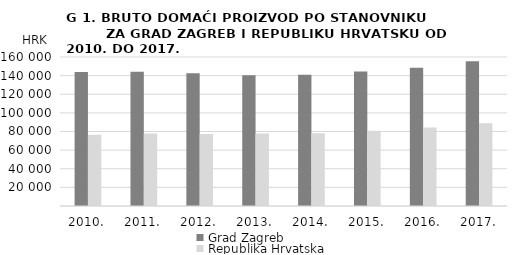
| Category | Grad Zagreb | Republika Hrvatska |
|---|---|---|
| 2010. | 143825.42 | 76536 |
| 2011. | 144287.653 | 77801 |
| 2012. | 142538.34 | 77420 |
| 2013. | 140459.128 | 77850 |
| 2014. | 140983.109 | 78220 |
| 2015. | 144541.612 | 80726 |
| 2016. | 148406.966 | 84164 |
| 2017. | 155540.901 | 88726 |